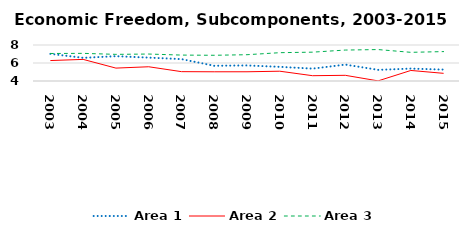
| Category | Area 1 | Area 2 | Area 3 |
|---|---|---|---|
| 2003.0 | 7.016 | 6.271 | 7.056 |
| 2004.0 | 6.573 | 6.4 | 7.071 |
| 2005.0 | 6.756 | 5.433 | 6.96 |
| 2006.0 | 6.598 | 5.582 | 6.996 |
| 2007.0 | 6.432 | 5.038 | 6.88 |
| 2008.0 | 5.692 | 5.024 | 6.858 |
| 2009.0 | 5.729 | 5.026 | 6.921 |
| 2010.0 | 5.574 | 5.088 | 7.146 |
| 2011.0 | 5.374 | 4.59 | 7.204 |
| 2012.0 | 5.824 | 4.631 | 7.438 |
| 2013.0 | 5.238 | 4.014 | 7.494 |
| 2014.0 | 5.378 | 5.17 | 7.185 |
| 2015.0 | 5.267 | 4.851 | 7.268 |